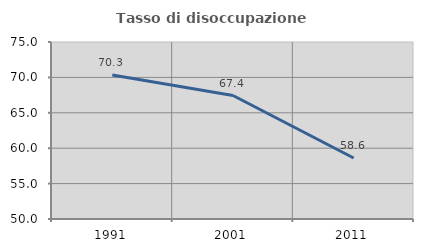
| Category | Tasso di disoccupazione giovanile  |
|---|---|
| 1991.0 | 70.339 |
| 2001.0 | 67.442 |
| 2011.0 | 58.621 |